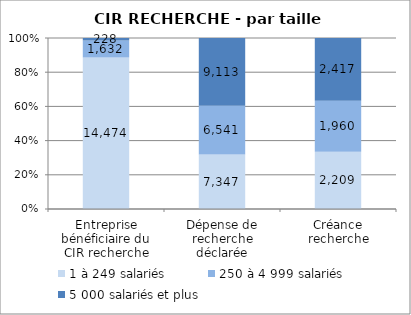
| Category | 1 à 249 salariés | 250 à 4 999 salariés | 5 000 salariés et plus |
|---|---|---|---|
| Entreprise bénéficiaire du CIR recherche | 14474 | 1632 | 228 |
| Dépense de recherche déclarée | 7347.41 | 6541.2 | 9113.12 |
| Créance recherche | 2208.68 | 1960.01 | 2416.67 |